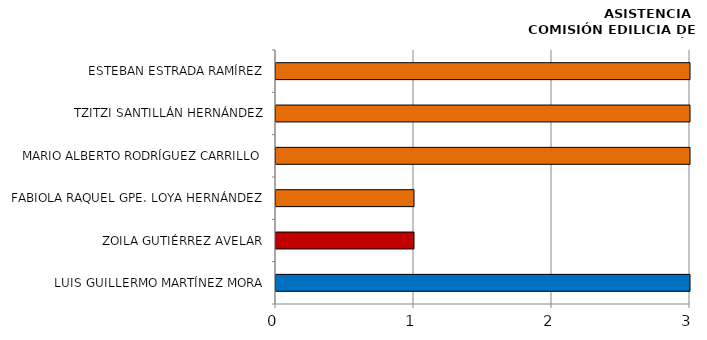
| Category | Series 0 |
|---|---|
| LUIS GUILLERMO MARTÍNEZ MORA | 3 |
| ZOILA GUTIÉRREZ AVELAR | 1 |
| FABIOLA RAQUEL GPE. LOYA HERNÁNDEZ | 1 |
| MARIO ALBERTO RODRÍGUEZ CARRILLO | 3 |
| TZITZI SANTILLÁN HERNÁNDEZ | 3 |
| ESTEBAN ESTRADA RAMÍREZ | 3 |